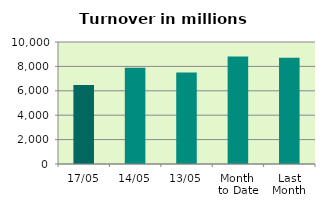
| Category | Series 0 |
|---|---|
| 17/05 | 6472.025 |
| 14/05 | 7891.963 |
| 13/05 | 7494.062 |
| Month 
to Date | 8819.686 |
| Last
Month | 8713.977 |